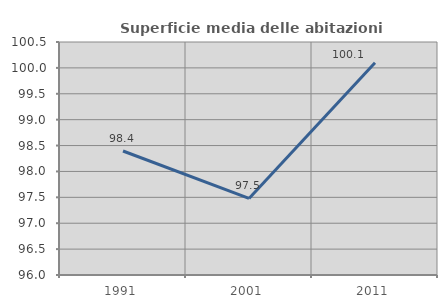
| Category | Superficie media delle abitazioni occupate |
|---|---|
| 1991.0 | 98.395 |
| 2001.0 | 97.479 |
| 2011.0 | 100.1 |